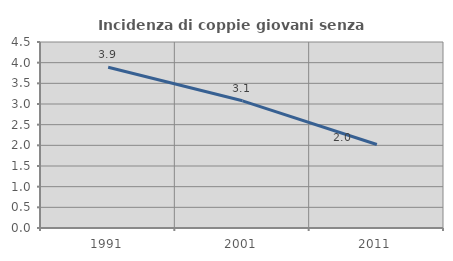
| Category | Incidenza di coppie giovani senza figli |
|---|---|
| 1991.0 | 3.889 |
| 2001.0 | 3.077 |
| 2011.0 | 2.019 |